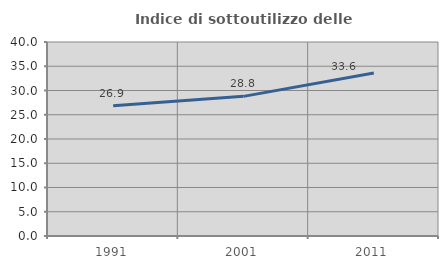
| Category | Indice di sottoutilizzo delle abitazioni  |
|---|---|
| 1991.0 | 26.869 |
| 2001.0 | 28.793 |
| 2011.0 | 33.588 |